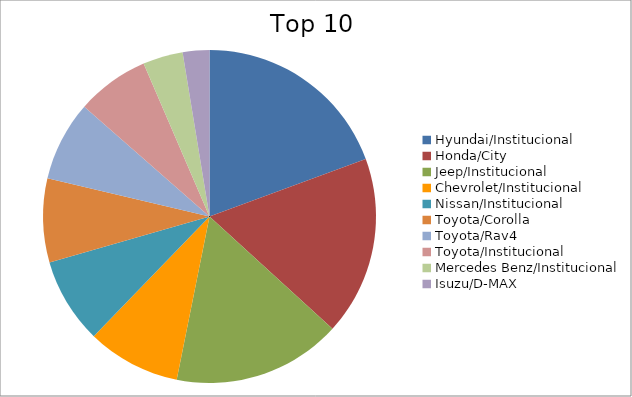
| Category | Series 0 |
|---|---|
| Hyundai/Institucional | 16.26 |
| Honda/City | 14.58 |
| Jeep/Institucional | 13.74 |
| Chevrolet/Institucional | 7.61 |
| Nissan/Institucional | 6.97 |
| Toyota/Corolla | 6.82 |
| Toyota/Rav4 | 6.52 |
| Toyota/Institucional | 5.93 |
| Mercedes Benz/Institucional | 3.26 |
| Isuzu/D-MAX | 2.17 |